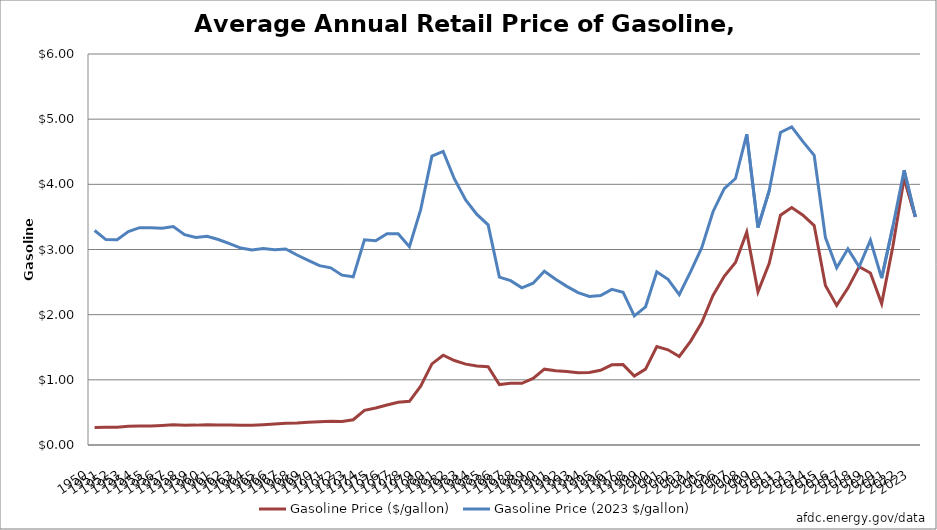
| Category | Gasoline Price ($/gallon) | Gasoline Price (2023 $/gallon) |
|---|---|---|
| 1950.0 | 0.268 | 3.291 |
| 1951.0 | 0.272 | 3.152 |
| 1952.0 | 0.274 | 3.151 |
| 1953.0 | 0.287 | 3.275 |
| 1954.0 | 0.29 | 3.335 |
| 1955.0 | 0.291 | 3.335 |
| 1956.0 | 0.299 | 3.328 |
| 1957.0 | 0.31 | 3.351 |
| 1958.0 | 0.304 | 3.228 |
| 1959.0 | 0.305 | 3.184 |
| 1960.0 | 0.311 | 3.203 |
| 1961.0 | 0.308 | 3.154 |
| 1962.0 | 0.306 | 3.091 |
| 1963.0 | 0.304 | 3.022 |
| 1964.0 | 0.304 | 2.991 |
| 1965.0 | 0.312 | 3.014 |
| 1966.0 | 0.321 | 2.995 |
| 1967.0 | 0.332 | 3.008 |
| 1968.0 | 0.337 | 2.915 |
| 1969.0 | 0.348 | 2.833 |
| 1970.0 | 0.357 | 2.752 |
| 1971.0 | 0.364 | 2.719 |
| 1972.0 | 0.361 | 2.606 |
| 1973.0 | 0.388 | 2.58 |
| 1974.0 | 0.532 | 3.149 |
| 1975.0 | 0.567 | 3.136 |
| 1976.0 | 0.614 | 3.242 |
| 1977.0 | 0.656 | 3.241 |
| 1978.0 | 0.67 | 3.042 |
| 1979.0 | 0.903 | 3.612 |
| 1980.0 | 1.245 | 4.432 |
| 1981.0 | 1.378 | 4.506 |
| 1982.0 | 1.296 | 4.082 |
| 1983.0 | 1.241 | 3.76 |
| 1984.0 | 1.212 | 3.539 |
| 1985.0 | 1.202 | 3.378 |
| 1986.0 | 0.927 | 2.577 |
| 1987.0 | 0.948 | 2.522 |
| 1988.0 | 0.946 | 2.412 |
| 1989.0 | 1.022 | 2.483 |
| 1990.0 | 1.164 | 2.666 |
| 1991.0 | 1.14 | 2.542 |
| 1992.0 | 1.127 | 2.434 |
| 1993.0 | 1.108 | 2.338 |
| 1994.0 | 1.112 | 2.28 |
| 1995.0 | 1.147 | 2.294 |
| 1996.0 | 1.231 | 2.388 |
| 1997.0 | 1.234 | 2.345 |
| 1998.0 | 1.059 | 1.98 |
| 1999.0 | 1.165 | 2.12 |
| 2000.0 | 1.51 | 2.658 |
| 2001.0 | 1.461 | 2.542 |
| 2002.0 | 1.358 | 2.309 |
| 2003.0 | 1.591 | 2.657 |
| 2004.0 | 1.88 | 3.027 |
| 2005.0 | 2.295 | 3.58 |
| 2006.0 | 2.589 | 3.935 |
| 2007.0 | 2.801 | 4.089 |
| 2008.0 | 3.266 | 4.768 |
| 2009.0 | 2.35 | 3.337 |
| 2010.0 | 2.788 | 3.903 |
| 2011.0 | 3.527 | 4.797 |
| 2012.0 | 3.644 | 4.883 |
| 2013.0 | 3.526 | 4.654 |
| 2014.0 | 3.367 | 4.444 |
| 2015.0 | 2.448 | 3.182 |
| 2016.0 | 2.142 | 2.72 |
| 2017.0 | 2.408 | 3.01 |
| 2018.0 | 2.735 | 2.735 |
| 2019.0 | 2.64 | 3.142 |
| 2020.0 | 2.17 | 2.561 |
| 2021.0 | 3.05 | 3.355 |
| 2022.0 | 4.094 | 4.217 |
| 2023.0 | 3.5 | 3.5 |